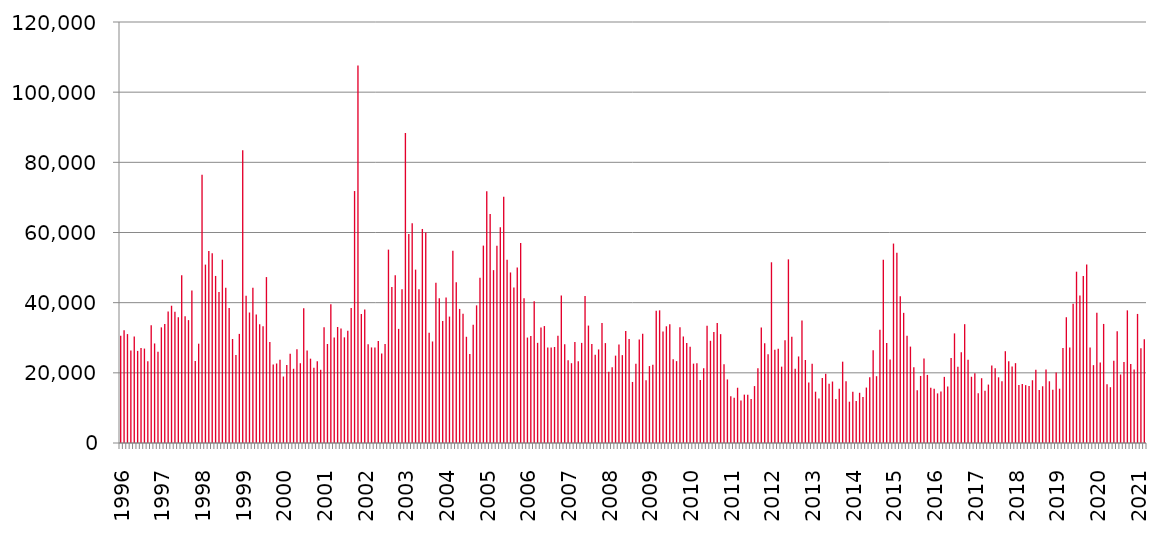
| Category | Series 0 |
|---|---|
| 1996.0 | 30565 |
| nan | 32123 |
| nan | 31044 |
| nan | 26401 |
| nan | 30370 |
| nan | 26254 |
| nan | 27073 |
| nan | 26911 |
| nan | 23273 |
| nan | 33595 |
| nan | 28374 |
| nan | 26036 |
| 1997.0 | 32963 |
| nan | 33890 |
| nan | 37509 |
| nan | 39128 |
| nan | 37399 |
| nan | 35850 |
| nan | 47806 |
| nan | 36117 |
| nan | 35023 |
| nan | 43488 |
| nan | 23397 |
| nan | 28305 |
| 1998.0 | 76429 |
| nan | 50851 |
| nan | 54713 |
| nan | 54112 |
| nan | 47617 |
| nan | 43007 |
| nan | 52250 |
| nan | 44252 |
| nan | 38498 |
| nan | 29638 |
| nan | 25062 |
| nan | 31098 |
| 1999.0 | 83423 |
| nan | 41965 |
| nan | 37191 |
| nan | 44236 |
| nan | 36632 |
| nan | 33845 |
| nan | 33248 |
| nan | 47294 |
| nan | 28815 |
| nan | 22406 |
| nan | 22665 |
| nan | 23726 |
| 2000.0 | 18950 |
| nan | 22265 |
| nan | 25419 |
| nan | 21159 |
| nan | 26713 |
| nan | 22736 |
| nan | 38395 |
| nan | 26379 |
| nan | 24035 |
| nan | 21466 |
| nan | 23271 |
| nan | 20879 |
| 2001.0 | 32965 |
| nan | 28222 |
| nan | 39557 |
| nan | 30046 |
| nan | 33063 |
| nan | 32645 |
| nan | 30113 |
| nan | 31974 |
| nan | 38459 |
| nan | 71817 |
| nan | 107589 |
| nan | 36768 |
| 2002.0 | 38060 |
| nan | 28131 |
| nan | 27242 |
| nan | 27255 |
| nan | 29074 |
| nan | 25539 |
| nan | 28215 |
| nan | 55117 |
| nan | 44435 |
| nan | 47808 |
| nan | 32529 |
| nan | 43837 |
| 2003.0 | 88327 |
| nan | 59597 |
| nan | 62620 |
| nan | 49416 |
| nan | 43798 |
| nan | 61007 |
| nan | 60030 |
| nan | 31400 |
| nan | 28943 |
| nan | 45683 |
| nan | 41241 |
| nan | 34803 |
| 2004.0 | 41446 |
| nan | 36034 |
| nan | 54779 |
| nan | 45804 |
| nan | 38217 |
| nan | 36816 |
| nan | 30279 |
| nan | 25336 |
| nan | 33712 |
| nan | 39233 |
| nan | 47110 |
| nan | 56266 |
| 2005.0 | 71750 |
| nan | 65255 |
| nan | 49275 |
| nan | 56256 |
| nan | 61526 |
| nan | 70220 |
| nan | 52226 |
| nan | 48610 |
| nan | 44307 |
| nan | 49999 |
| nan | 57010 |
| nan | 41262 |
| 2006.0 | 30057 |
| nan | 30492 |
| nan | 40434 |
| nan | 28545 |
| nan | 32934 |
| nan | 33331 |
| nan | 27232 |
| nan | 27227 |
| nan | 27362 |
| nan | 30541 |
| nan | 42045 |
| nan | 28139 |
| 2007.0 | 23612 |
| nan | 22747 |
| nan | 28800 |
| nan | 23287 |
| nan | 28534 |
| nan | 41888 |
| nan | 33468 |
| nan | 28249 |
| nan | 25173 |
| nan | 26672 |
| nan | 34222 |
| nan | 28477 |
| 2008.0 | 20317 |
| nan | 21603 |
| nan | 24900 |
| nan | 28044 |
| nan | 25045 |
| nan | 31958 |
| nan | 29617 |
| nan | 17400 |
| nan | 22606 |
| nan | 29515 |
| nan | 31141 |
| nan | 17871 |
| 2009.0 | 21922 |
| nan | 22273 |
| nan | 37691 |
| nan | 37814 |
| nan | 31759 |
| nan | 33266 |
| nan | 33847 |
| nan | 23861 |
| nan | 23337 |
| nan | 33006 |
| nan | 30362 |
| nan | 28492 |
| 2010.0 | 27450 |
| nan | 22616 |
| nan | 22731 |
| nan | 17976 |
| nan | 21322 |
| nan | 33400 |
| nan | 29135 |
| nan | 31611 |
| nan | 34182 |
| nan | 31026 |
| nan | 22439 |
| nan | 18115 |
| 2011.0 | 13316 |
| nan | 12864 |
| nan | 15754 |
| nan | 12139 |
| nan | 13789 |
| nan | 13734 |
| nan | 12532 |
| nan | 16226 |
| nan | 21335 |
| nan | 32945 |
| nan | 28411 |
| nan | 25267 |
| 2012.0 | 51510 |
| nan | 26596 |
| nan | 26832 |
| nan | 21765 |
| nan | 29303 |
| nan | 52347 |
| nan | 30268 |
| nan | 21147 |
| nan | 24668 |
| nan | 34903 |
| nan | 23658 |
| nan | 17274 |
| 2013.0 | 22563 |
| nan | 14625 |
| nan | 12699 |
| nan | 18561 |
| nan | 19723 |
| nan | 16907 |
| nan | 17520 |
| nan | 12540 |
| nan | 15437 |
| nan | 23184 |
| nan | 17588 |
| nan | 11776 |
| 2014.0 | 14586 |
| nan | 11955 |
| nan | 14313 |
| nan | 13092 |
| nan | 15802 |
| nan | 18723 |
| nan | 26437 |
| nan | 19044 |
| nan | 32284 |
| nan | 52247 |
| nan | 28493 |
| nan | 23777 |
| 2015.0 | 56844 |
| nan | 54236 |
| nan | 41842 |
| nan | 37095 |
| nan | 30576 |
| nan | 27477 |
| nan | 21618 |
| nan | 15038 |
| nan | 19111 |
| nan | 24093 |
| nan | 19410 |
| nan | 15763 |
| 2016.0 | 15437 |
| nan | 14139 |
| nan | 14651 |
| nan | 18849 |
| nan | 16093 |
| nan | 24250 |
| nan | 31240 |
| nan | 21702 |
| nan | 25896 |
| nan | 33869 |
| nan | 23745 |
| nan | 18884 |
| 2017.0 | 19855 |
| nan | 14198 |
| nan | 18466 |
| nan | 14903 |
| nan | 16658 |
| nan | 22085 |
| nan | 21288 |
| nan | 18723 |
| nan | 17630 |
| nan | 26163 |
| nan | 23289 |
| nan | 21791 |
| 2018.0 | 22760 |
| nan | 16515 |
| nan | 16828 |
| nan | 16495 |
| nan | 16238 |
| nan | 17890 |
| nan | 20891 |
| nan | 15083 |
| nan | 16174 |
| nan | 20928 |
| nan | 17597 |
| nan | 15201 |
| 2019.0 | 20124 |
| nan | 15478 |
| nan | 27086 |
| nan | 35849 |
| nan | 27253 |
| nan | 39668 |
| nan | 48828 |
| nan | 42071 |
| nan | 47584 |
| nan | 50870 |
| nan | 27234 |
| nan | 22192 |
| 2020.0 | 37109 |
| nan | 22975 |
| nan | 33939 |
| nan | 16770 |
| nan | 15910 |
| nan | 23457 |
| nan | 31858 |
| nan | 19528 |
| nan | 23104 |
| nan | 37808 |
| nan | 22500 |
| nan | 20922 |
| 2021.0 | 36789 |
| nan | 27027 |
| nan | 29561 |